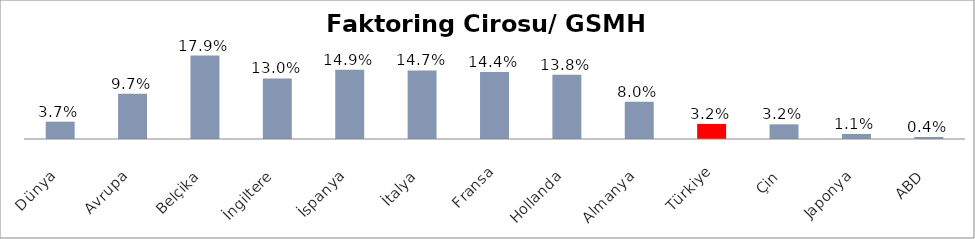
| Category | Faktoring Cirosu/ GSMH (%) |
|---|---|
| Dünya | 0.037 |
| Avrupa | 0.097 |
| Belçika | 0.179 |
| İngiltere | 0.13 |
| İspanya | 0.149 |
| İtalya | 0.147 |
| Fransa | 0.144 |
| Hollanda | 0.138 |
| Almanya | 0.08 |
| Türkiye | 0.032 |
| Çin | 0.032 |
| Japonya | 0.011 |
| ABD | 0.004 |